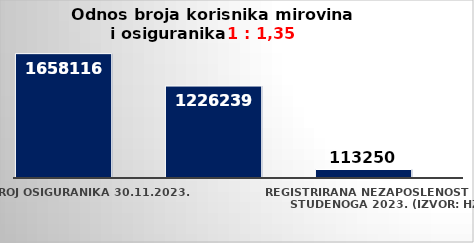
| Category | Series 0 | Series 1 |
|---|---|---|
| Broj osiguranika 30.11.2023. | 1658116 |  |
| Broj korisnika mirovine za studeni 2023. (isplata u prosincu 2023.) | 1226239 |  |
| Registrirana nezaposlenost krajem studenoga 2023. (izvor: HZZ) | 113250 |  |